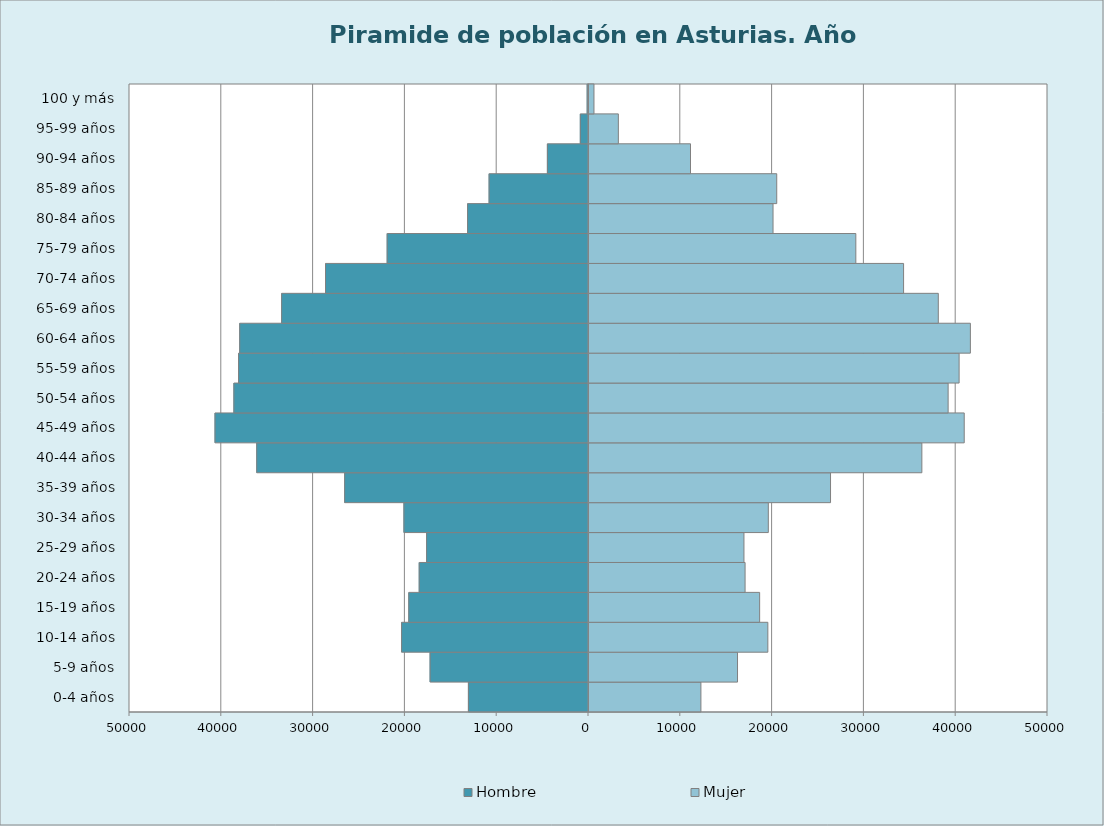
| Category | Hombre | Mujer |
|---|---|---|
| 0-4 años | -13081 | 12191 |
| 5-9 años | -17255 | 16179 |
| 10-14 años | -20359 | 19483 |
| 15-19 años | -19577 | 18589 |
| 20-24 años | -18440 | 17003 |
| 25-29 años | -17635 | 16881 |
| 30-34 años | -20103 | 19533 |
| 35-39 años | -26561 | 26311 |
| 40-44 años | -36139 | 36260 |
| 45-49 años | -40683 | 40874 |
| 50-54 años | -38627 | 39122 |
| 55-59 años | -38118 | 40317 |
| 60-64 años | -37994 | 41545 |
| 65-69 años | -33426 | 38051 |
| 70-74 años | -28647 | 34269 |
| 75-79 años | -21931 | 29067 |
| 80-84 años | -13171 | 20048 |
| 85-89 años | -10826 | 20451 |
| 90-94 años | -4477 | 11058 |
| 95-99 años | -891 | 3198 |
| 100 y más | -143 | 542 |